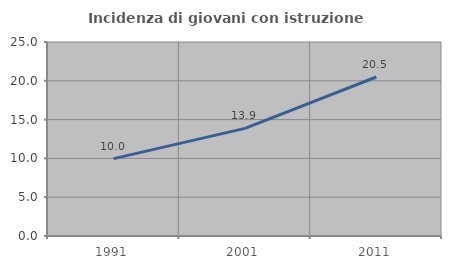
| Category | Incidenza di giovani con istruzione universitaria |
|---|---|
| 1991.0 | 9.975 |
| 2001.0 | 13.868 |
| 2011.0 | 20.489 |